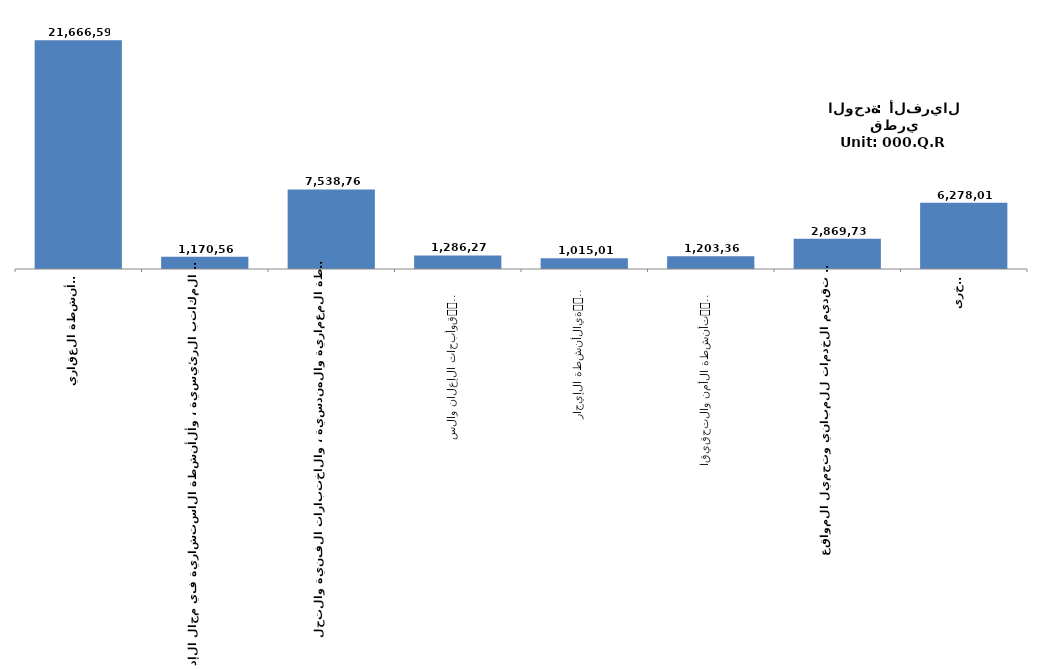
| Category | Series 0 |
|---|---|
| الأنشطة العقارية
Real estate activities | 21666596 |
| أنشطة المكاتب الرئيسية ، وألأنشطة الاستشارية في مجال الإدارة
Activities of head offices; management
consultancy activities | 1170560 |
| الأنشطة المعمارية والهندسية ، والاختبارات الفنية والتحليل
Architectural and engineering activities; technical
testing and analysis | 7538766 |
| أبحاث الإعلان والسوق
Advertising and market research | 1286272 |
| الأنشطة الإيجارية
Rental and leasing activities | 1015013 |
| أنشطة الأمن والتحقيقات
Security and investigation activities | 1203361 |
| أنشطة تقديم الخدمات للمباني وتجميل المواقع
Services to buildings and landscape
activities | 2869732 |
| أخرى
Other | 6278010 |